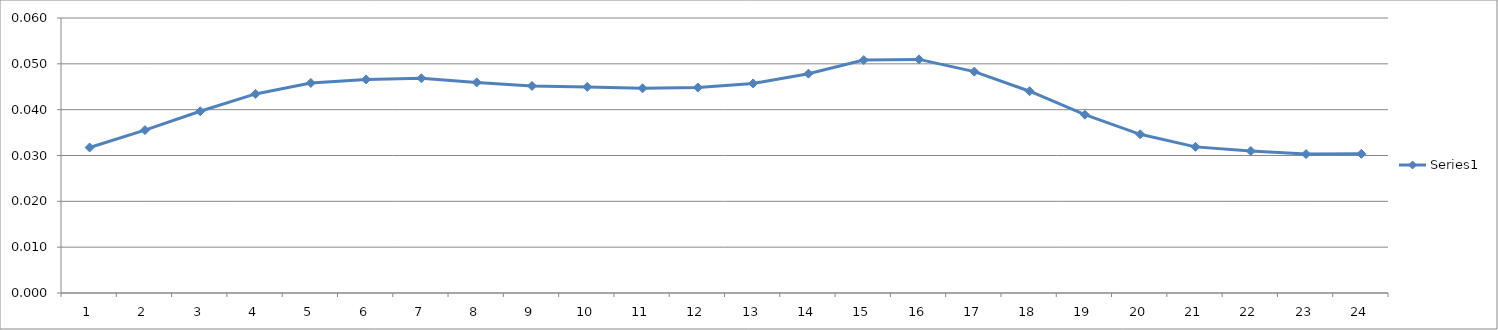
| Category | Series 0 |
|---|---|
| 0 | 0.032 |
| 1 | 0.036 |
| 2 | 0.04 |
| 3 | 0.043 |
| 4 | 0.046 |
| 5 | 0.047 |
| 6 | 0.047 |
| 7 | 0.046 |
| 8 | 0.045 |
| 9 | 0.045 |
| 10 | 0.045 |
| 11 | 0.045 |
| 12 | 0.046 |
| 13 | 0.048 |
| 14 | 0.051 |
| 15 | 0.051 |
| 16 | 0.048 |
| 17 | 0.044 |
| 18 | 0.039 |
| 19 | 0.035 |
| 20 | 0.032 |
| 21 | 0.031 |
| 22 | 0.03 |
| 23 | 0.03 |